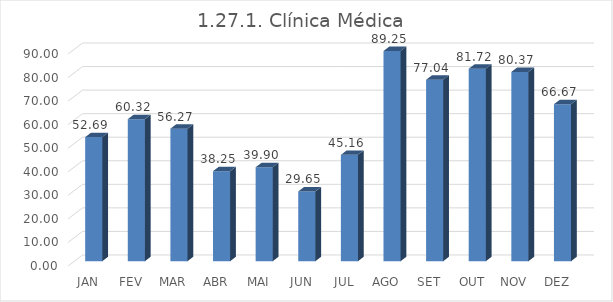
| Category | 1.27.1. Clínica Médica  |
|---|---|
|  JAN  | 52.688 |
|  FEV  | 60.317 |
|  MAR  | 56.272 |
|  ABR  | 38.246 |
|  MAI  | 39.898 |
|  JUN  | 29.649 |
|  JUL  | 45.161 |
|  AGO  | 89.247 |
|  SET  | 77.037 |
|  OUT  | 81.72 |
|  NOV  | 80.37 |
|  DEZ  | 66.667 |